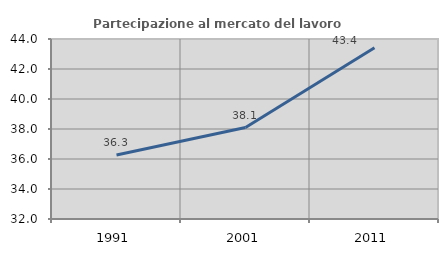
| Category | Partecipazione al mercato del lavoro  femminile |
|---|---|
| 1991.0 | 36.261 |
| 2001.0 | 38.099 |
| 2011.0 | 43.417 |